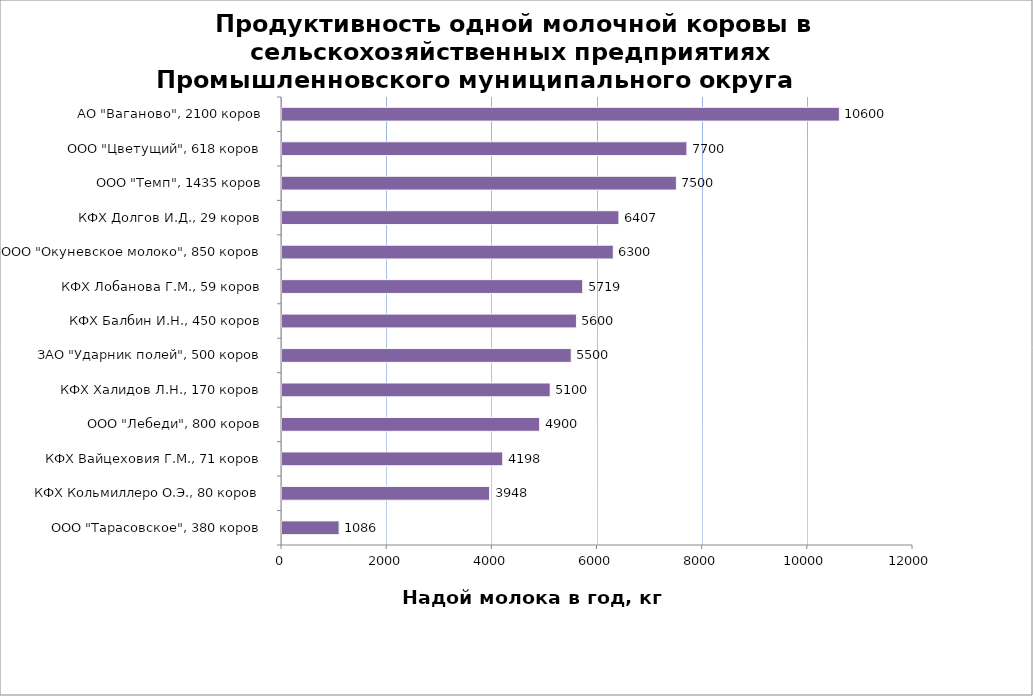
| Category | Series 0 |
|---|---|
| ООО "Тарасовское", 380 коров | 1086 |
| КФХ Кольмиллеро О.Э., 80 коров | 3948 |
| КФХ Вайцеховия Г.М., 71 коров | 4198 |
| ООО "Лебеди", 800 коров | 4900 |
| КФХ Халидов Л.Н., 170 коров | 5100 |
| ЗАО "Ударник полей", 500 коров | 5500 |
| КФХ Балбин И.Н., 450 коров | 5600 |
| КФХ Лобанова Г.М., 59 коров | 5719 |
| ООО "Окуневское молоко", 850 коров | 6300 |
| КФХ Долгов И.Д., 29 коров | 6407 |
| ООО "Темп", 1435 коров | 7500 |
| ООО "Цветущий", 618 коров | 7700 |
| АО "Ваганово", 2100 коров | 10600 |